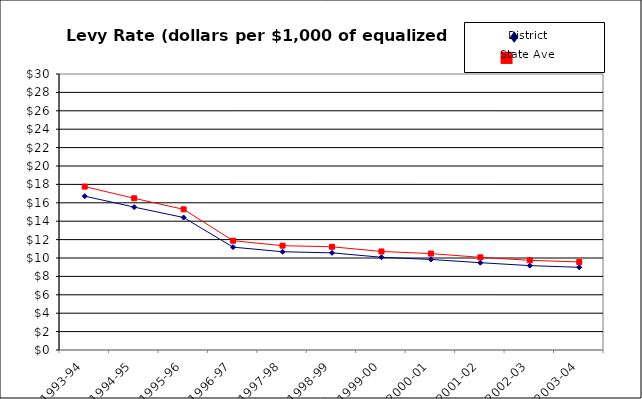
| Category | DISTRICT | STATEWIDE |
|---|---|---|
| 1993-94 | 16.72 | 17.76 |
| 1994-95 | 15.53 | 16.49 |
| 1995-96 | 14.4 | 15.29 |
| 1996-97 | 11.18 | 11.88 |
| 1997-98 | 10.68 | 11.34 |
| 1998-99 | 10.56 | 11.22 |
| 1999-00 | 10.08 | 10.71 |
| 2000-01 | 9.84 | 10.48 |
| 2001-02 | 9.49 | 10.07 |
| 2002-03 | 9.17 | 9.75 |
| 2003-04 | 8.99 | 9.57 |